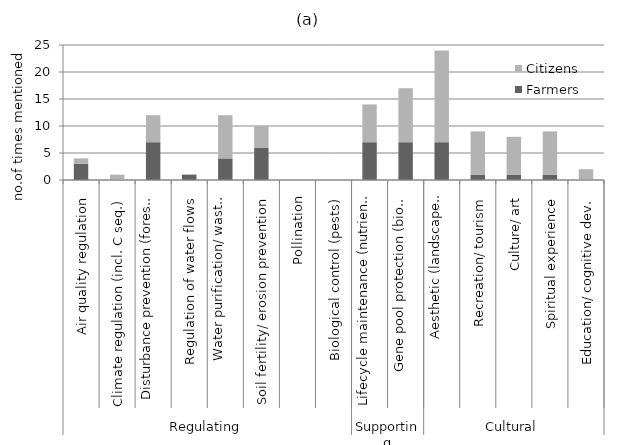
| Category | Farmers | Citizens |
|---|---|---|
| 0 | 3 | 1 |
| 1 | 0 | 1 |
| 2 | 7 | 5 |
| 3 | 1 | 0 |
| 4 | 4 | 8 |
| 5 | 6 | 4 |
| 6 | 0 | 0 |
| 7 | 0 | 0 |
| 8 | 7 | 7 |
| 9 | 7 | 10 |
| 10 | 7 | 17 |
| 11 | 1 | 8 |
| 12 | 1 | 7 |
| 13 | 1 | 8 |
| 14 | 0 | 2 |